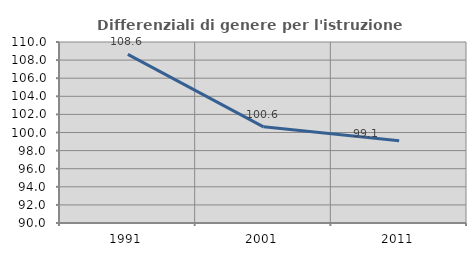
| Category | Differenziali di genere per l'istruzione superiore |
|---|---|
| 1991.0 | 108.631 |
| 2001.0 | 100.628 |
| 2011.0 | 99.098 |